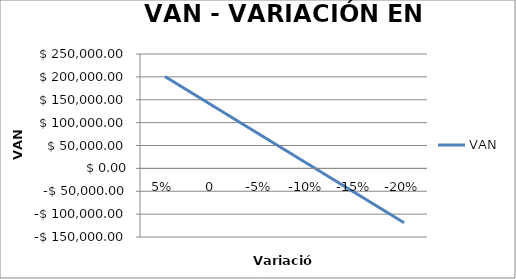
| Category | VAN | VARIACIONES INGRESOS | TMAR |
|---|---|---|---|
| 0.05 | 200878.93 |  |  |
| 0.0 | 136914.02 |  |  |
| -0.05 | 72949.11 |  |  |
| -0.1 | 8984.2 |  |  |
| -0.15 | -54980.71 |  |  |
| -0.2 | -118945.62 |  |  |